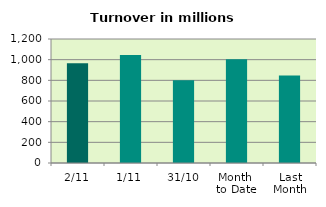
| Category | Series 0 |
|---|---|
| 2/11 | 964.299 |
| 1/11 | 1044.007 |
| 31/10 | 800.506 |
| Month 
to Date | 1004.153 |
| Last
Month | 847.422 |